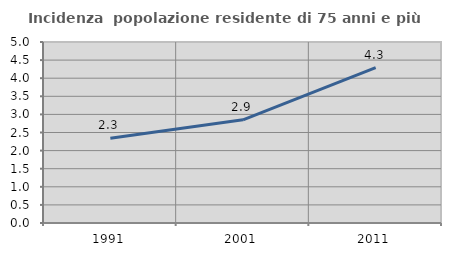
| Category | Incidenza  popolazione residente di 75 anni e più |
|---|---|
| 1991.0 | 2.341 |
| 2001.0 | 2.85 |
| 2011.0 | 4.289 |